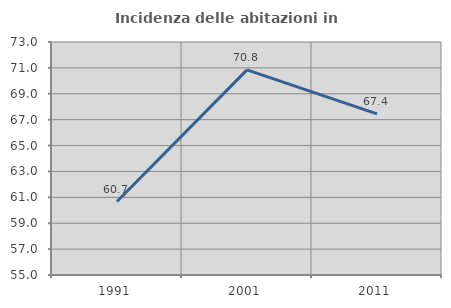
| Category | Incidenza delle abitazioni in proprietà  |
|---|---|
| 1991.0 | 60.678 |
| 2001.0 | 70.849 |
| 2011.0 | 67.448 |